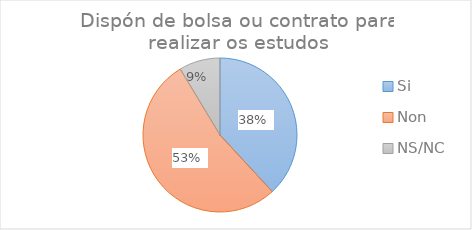
| Category | Series 25 |
|---|---|
| Si | 0.381 |
| Non | 0.532 |
| NS/NC | 0.086 |